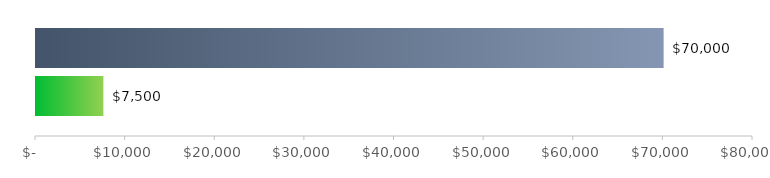
| Category | TOTALE FINANZIAMENTO | TOTALE SPESE |
|---|---|---|
| 0 | 70000 | 7500 |